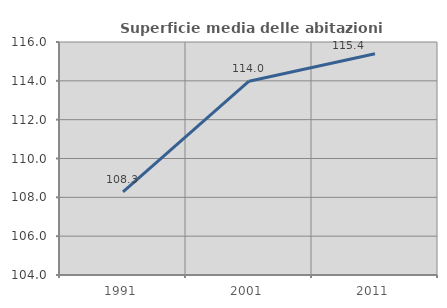
| Category | Superficie media delle abitazioni occupate |
|---|---|
| 1991.0 | 108.283 |
| 2001.0 | 113.981 |
| 2011.0 | 115.398 |